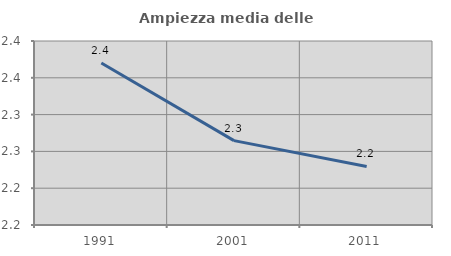
| Category | Ampiezza media delle famiglie |
|---|---|
| 1991.0 | 2.37 |
| 2001.0 | 2.265 |
| 2011.0 | 2.23 |